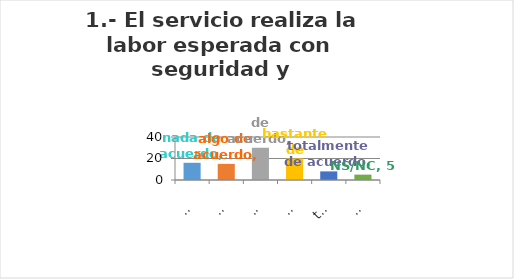
| Category | Series 0 |
|---|---|
| nada de acuerdo | 16 |
| algo de acuerdo | 15 |
| de acuerdo | 30 |
| bastante de acuerdo | 20 |
| totalmente de acuerdo | 8 |
| NS/NC | 5 |